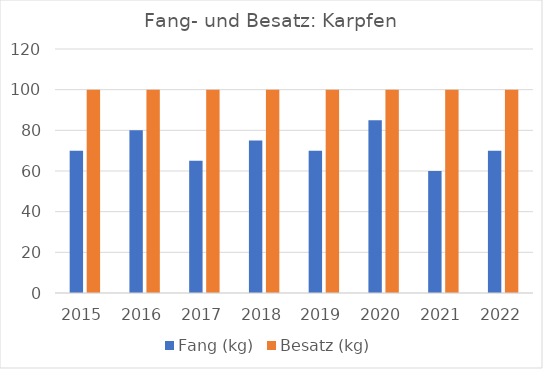
| Category | Fang (kg) | Besatz (kg) |
|---|---|---|
| 2015.0 | 70 | 100 |
| 2016.0 | 80 | 100 |
| 2017.0 | 65 | 100 |
| 2018.0 | 75 | 100 |
| 2019.0 | 70 | 100 |
| 2020.0 | 85 | 100 |
| 2021.0 | 60 | 100 |
| 2022.0 | 70 | 100 |